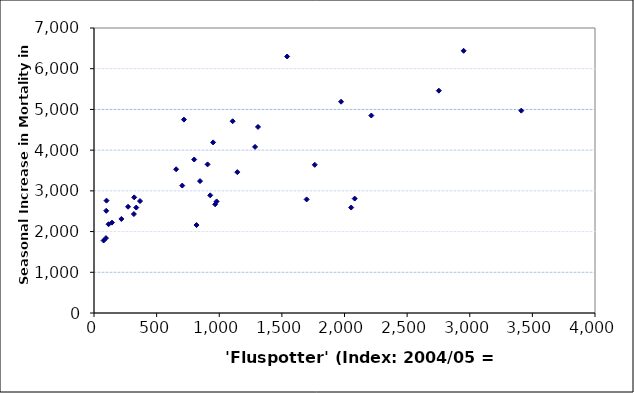
| Category | Seas. Incr. Mort. |
|---|---|
| 3411.6279069767443 | 4970 |
| 1286.046511627907 | 4080 |
| 2081.3953488372094 | 2810 |
| 1144.1860465116279 | 3460 |
| 2951.1627906976746 | 6440 |
| 655.8139534883721 | 3530 |
| 2213.953488372093 | 4850 |
| 951.1627906976744 | 4190 |
| 967.4418604651163 | 2670 |
| 800.0 | 3770 |
| 1541.860465116279 | 6300 |
| 1309.3023255813953 | 4570 |
| 1697.6744186046512 | 2790 |
| 704.6511627906976 | 3130 |
| 1106.9767441860465 | 4710 |
| 846.5116279069767 | 3240 |
| 337.2093023255814 | 2590 |
| 818.6046511627907 | 2160 |
| 2753.4883720930234 | 5460 |
| 318.6046511627907 | 2430 |
| 927.9069767441861 | 2890 |
| 979.0697674418604 | 2740 |
| 2053.4883720930234 | 2590 |
| 218.6046511627907 | 2310 |
| 906.9767441860465 | 3650 |
| 1762.7906976744187 | 3640 |
| 271.71372093023257 | 2610 |
| 717.8420930232558 | 4750 |
| 1972.5908557312382 | 5190 |
| 143.5706982761487 | 2220 |
| 95.34883720930233 | 1840 |
| 97.50371985096723 | 2510 |
| 320.93023255813955 | 2840 |
| 100.0 | 2760 |
| 76.74418604651163 | 1780 |
| 367.4418604651163 | 2750 |
| 116.27906976744185 | 2180 |